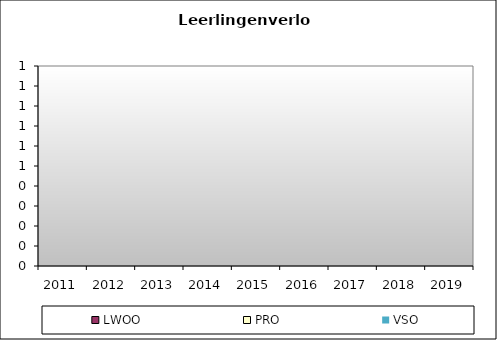
| Category | LWOO | PRO | VSO |
|---|---|---|---|
| 2011.0 | 0 | 0 | 0 |
| 2012.0 | 0 | 0 | 0 |
| 2013.0 | 0 | 0 | 0 |
| 2014.0 | 0 | 0 | 0 |
| 2015.0 | 0 | 0 | 0 |
| 2016.0 | 0 | 0 | 0 |
| 2017.0 | 0 | 0 | 0 |
| 2018.0 | 0 | 0 | 0 |
| 2019.0 | 0 | 0 | 0 |